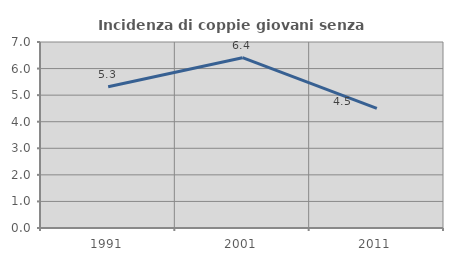
| Category | Incidenza di coppie giovani senza figli |
|---|---|
| 1991.0 | 5.316 |
| 2001.0 | 6.41 |
| 2011.0 | 4.505 |